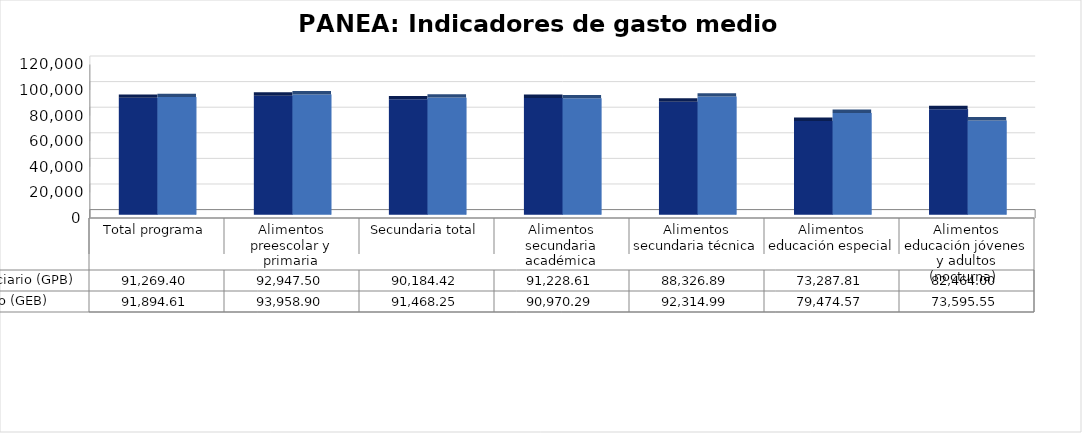
| Category | Gasto programado acumulado por beneficiario (GPB)  | Gasto efectivo acumulado por beneficiario (GEB)  |
|---|---|---|
| Total programa | 91269.4 | 91894.613 |
| Alimentos preescolar y primaria | 92947.504 | 93958.896 |
| Secundaria total | 90184.418 | 91468.255 |
| Alimentos secundaria académica | 91228.608 | 90970.287 |
| Alimentos secundaria técnica | 88326.888 | 92314.991 |
| Alimentos educación especial | 73287.808 | 79474.573 |
| Alimentos educación jóvenes y adultos (nocturna)  | 82463.999 | 73595.549 |